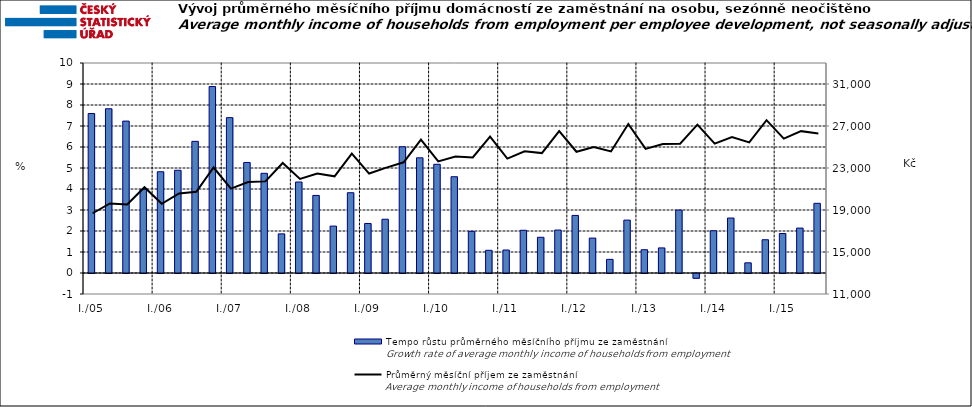
| Category | Tempo růstu průměrného měsíčního příjmu ze zaměstnání |
|---|---|
| I./05 | 7.592 |
|  | 7.822 |
|  | 7.233 |
|  | 3.981 |
| I./06 | 4.822 |
|  | 4.892 |
|  | 6.269 |
|  | 8.878 |
| I./07 | 7.399 |
|  | 5.263 |
|  | 4.746 |
|  | 1.864 |
| I./08 | 4.333 |
|  | 3.694 |
|  | 2.233 |
|  | 3.823 |
| I./09 | 2.357 |
|  | 2.56 |
|  | 6.011 |
|  | 5.485 |
| I./10 | 5.177 |
|  | 4.584 |
|  | 1.983 |
|  | 1.08 |
| I./11 | 1.094 |
|  | 2.034 |
|  | 1.701 |
|  | 2.046 |
| I./12 | 2.742 |
|  | 1.662 |
|  | 0.65 |
|  | 2.518 |
| I./13 | 1.107 |
|  | 1.195 |
|  | 2.996 |
|  | -0.228 |
| I./14 | 2.011 |
|  | 2.618 |
|  | 0.484 |
|  | 1.584 |
| I./15 | 1.881 |